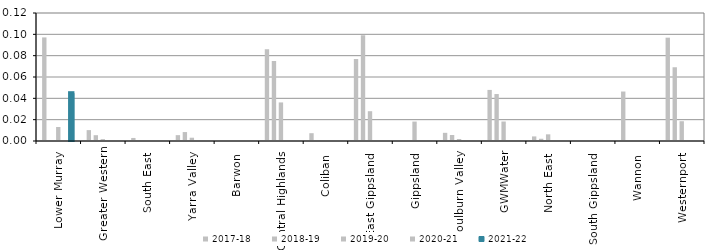
| Category | 2017-18 | 2018-19 | 2019-20 | 2020-21 | 2021-22 |
|---|---|---|---|---|---|
| Lower Murray  | 0.097 | 0 | 0.013 | 0 | 0.045 |
| Greater Western | 0.01 | 0.005 | 0.002 | 0 | 0 |
| South East  | 0.003 | 0 | 0.001 | 0 | 0 |
| Yarra Valley  | 0.005 | 0.008 | 0.003 | 0 | 0 |
| Barwon  | 0 | 0 | 0 | 0 | 0 |
| Central Highlands  | 0.086 | 0.075 | 0.036 | 0 | 0 |
| Coliban  | 0.007 | 0 | 0 | 0 | 0 |
| East Gippsland  | 0.077 | 0.099 | 0.028 | 0 | 0 |
| Gippsland  | 0 | 0 | 0.018 | 0 | 0 |
| Goulburn Valley  | 0.008 | 0.006 | 0.002 | 0 | 0 |
| GWMWater | 0.048 | 0.044 | 0.018 | 0 | 0 |
| North East  | 0.004 | 0.002 | 0.006 | 0 | 0 |
| South Gippsland  | 0 | 0 | 0 | 0 | 0 |
| Wannon  | 0.046 | 0 | 0 | 0 | 0 |
| Westernport  | 0.097 | 0.069 | 0.019 | 0 | 0 |